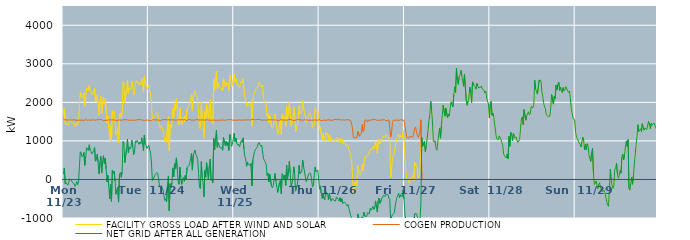
| Category | FACILITY GROSS LOAD AFTER WIND AND SOLAR | COGEN PRODUCTION | NET GRID AFTER ALL GENERATION |
|---|---|---|---|
|  Mon  11/23 | 1685 | 1545 | 140 |
|  Mon  11/23 | 1850 | 1551 | 299 |
|  Mon  11/23 | 1439 | 1550 | -111 |
|  Mon  11/23 | 1461 | 1546 | -85 |
|  Mon  11/23 | 1432 | 1540 | -108 |
|  Mon  11/23 | 1397 | 1543 | -146 |
|  Mon  11/23 | 1468 | 1544 | -76 |
|  Mon  11/23 | 1556 | 1539 | 17 |
|  Mon  11/23 | 1551 | 1543 | 8 |
|  Mon  11/23 | 1516 | 1541 | -25 |
|  Mon  11/23 | 1463 | 1539 | -76 |
|  Mon  11/23 | 1457 | 1539 | -82 |
|  Mon  11/23 | 1445 | 1555 | -110 |
|  Mon  11/23 | 1373 | 1554 | -181 |
|  Mon  11/23 | 1398 | 1533 | -135 |
|  Mon  11/23 | 1483 | 1537 | -54 |
|  Mon  11/23 | 1400 | 1538 | -138 |
|  Mon  11/23 | 1481 | 1542 | -61 |
|  Mon  11/23 | 1896 | 1538 | 358 |
|  Mon  11/23 | 2267 | 1547 | 720 |
|  Mon  11/23 | 2223 | 1538 | 685 |
|  Mon  11/23 | 2127 | 1544 | 583 |
|  Mon  11/23 | 2154 | 1538 | 616 |
|  Mon  11/23 | 2249 | 1549 | 700 |
|  Mon  11/23 | 1902 | 1537 | 365 |
|  Mon  11/23 | 2119 | 1541 | 578 |
|  Mon  11/23 | 2381 | 1557 | 824 |
|  Mon  11/23 | 2376 | 1528 | 848 |
|  Mon  11/23 | 2300 | 1548 | 752 |
|  Mon  11/23 | 2446 | 1547 | 899 |
|  Mon  11/23 | 2305 | 1546 | 759 |
|  Mon  11/23 | 2257 | 1533 | 724 |
|  Mon  11/23 | 2202 | 1540 | 662 |
|  Mon  11/23 | 2196 | 1552 | 644 |
|  Mon  11/23 | 2293 | 1542 | 751 |
|  Mon  11/23 | 2361 | 1534 | 827 |
|  Mon  11/23 | 2014 | 1540 | 474 |
|  Mon  11/23 | 2079 | 1546 | 533 |
|  Mon  11/23 | 2195 | 1536 | 659 |
|  Mon  11/23 | 1981 | 1546 | 435 |
|  Mon  11/23 | 1675 | 1529 | 146 |
|  Mon  11/23 | 1996 | 1555 | 441 |
|  Mon  11/23 | 2155 | 1553 | 602 |
|  Mon  11/23 | 1715 | 1549 | 166 |
|  Mon  11/23 | 1988 | 1543 | 445 |
|  Mon  11/23 | 2144 | 1528 | 616 |
|  Mon  11/23 | 1953 | 1537 | 416 |
|  Mon  11/23 | 2079 | 1534 | 545 |
|  Mon  11/23 | 1812 | 1539 | 273 |
|  Mon  11/23 | 1471 | 1535 | -64 |
|  Mon  11/23 | 1641 | 1533 | 108 |
|  Mon  11/23 | 1363 | 1547 | -184 |
|  Mon  11/23 | 1031 | 1539 | -508 |
|  Mon  11/23 | 1411 | 1544 | -133 |
|  Mon  11/23 | 973 | 1542 | -569 |
|  Mon  11/23 | 1785 | 1543 | 242 |
|  Mon  11/23 | 1711 | 1550 | 161 |
|  Mon  11/23 | 1764 | 1547 | 217 |
|  Mon  11/23 | 1497 | 1535 | -38 |
|  Mon  11/23 | 1149 | 1531 | -382 |
|  Mon  11/23 | 1178 | 1536 | -358 |
|  Mon  11/23 | 1331 | 1533 | -202 |
|  Mon  11/23 | 958 | 1546 | -588 |
|  Mon  11/23 | 1672 | 1544 | 128 |
|  Mon  11/23 | 1723 | 1544 | 179 |
|  Mon  11/23 | 1591 | 1534 | 57 |
|  Mon  11/23 | 1741 | 1542 | 199 |
|  Mon  11/23 | 2535 | 1548 | 987 |
|  Mon  11/23 | 2485 | 1544 | 941 |
|  Mon  11/23 | 1985 | 1550 | 435 |
|  Mon  11/23 | 1994 | 1544 | 450 |
|  Mon  11/23 | 2357 | 1550 | 807 |
|  Mon  11/23 | 2582 | 1538 | 1044 |
|  Mon  11/23 | 2235 | 1538 | 697 |
|  Mon  11/23 | 2374 | 1536 | 838 |
|  Mon  11/23 | 2335 | 1538 | 797 |
|  Mon  11/23 | 2388 | 1548 | 840 |
|  Mon  11/23 | 2552 | 1537 | 1015 |
|  Mon  11/23 | 2377 | 1539 | 838 |
|  Mon  11/23 | 2187 | 1539 | 648 |
|  Mon  11/23 | 2280 | 1531 | 749 |
|  Mon  11/23 | 2538 | 1535 | 1003 |
|  Mon  11/23 | 2505 | 1542 | 963 |
|  Mon  11/23 | 2565 | 1548 | 1017 |
|  Mon  11/23 | 2577 | 1540 | 1037 |
|  Mon  11/23 | 2467 | 1556 | 911 |
|  Mon  11/23 | 2517 | 1543 | 974 |
|  Mon  11/23 | 2463 | 1545 | 918 |
|  Mon  11/23 | 2627 | 1545 | 1082 |
|  Mon  11/23 | 2457 | 1540 | 917 |
|  Mon  11/23 | 2281 | 1540 | 741 |
|  Mon  11/23 | 2686 | 1532 | 1154 |
|  Mon  11/23 | 2463 | 1542 | 921 |
|  Mon  11/23 | 2429 | 1539 | 890 |
|  Mon  11/23 | 2339 | 1534 | 805 |
|  Mon  11/23 | 2363 | 1541 | 822 |
|  Tue  11/24 | 2447 | 1558 | 889 |
|  Tue  11/24 | 2291 | 1522 | 769 |
|  Tue  11/24 | 2225 | 1543 | 682 |
|  Tue  11/24 | 1953 | 1528 | 425 |
|  Tue  11/24 | 1520 | 1548 | -28 |
|  Tue  11/24 | 1565 | 1556 | 9 |
|  Tue  11/24 | 1610 | 1547 | 63 |
|  Tue  11/24 | 1665 | 1543 | 122 |
|  Tue  11/24 | 1704 | 1552 | 152 |
|  Tue  11/24 | 1730 | 1549 | 181 |
|  Tue  11/24 | 1699 | 1544 | 155 |
|  Tue  11/24 | 1555 | 1539 | 16 |
|  Tue  11/24 | 1364 | 1537 | -173 |
|  Tue  11/24 | 1320 | 1527 | -207 |
|  Tue  11/24 | 1393 | 1551 | -158 |
|  Tue  11/24 | 1330 | 1549 | -219 |
|  Tue  11/24 | 1275 | 1552 | -277 |
|  Tue  11/24 | 1131 | 1551 | -420 |
|  Tue  11/24 | 997 | 1542 | -545 |
|  Tue  11/24 | 1055 | 1555 | -500 |
|  Tue  11/24 | 965 | 1544 | -579 |
|  Tue  11/24 | 1393 | 1544 | -151 |
|  Tue  11/24 | 1635 | 1543 | 92 |
|  Tue  11/24 | 735 | 1548 | -813 |
|  Tue  11/24 | 1428 | 1537 | -109 |
|  Tue  11/24 | 1331 | 1546 | -215 |
|  Tue  11/24 | 1451 | 1540 | -89 |
|  Tue  11/24 | 1843 | 1543 | 300 |
|  Tue  11/24 | 1594 | 1528 | 66 |
|  Tue  11/24 | 1953 | 1545 | 408 |
|  Tue  11/24 | 1804 | 1533 | 271 |
|  Tue  11/24 | 2096 | 1536 | 560 |
|  Tue  11/24 | 1820 | 1547 | 273 |
|  Tue  11/24 | 1505 | 1551 | -46 |
|  Tue  11/24 | 1413 | 1538 | -125 |
|  Tue  11/24 | 1862 | 1545 | 317 |
|  Tue  11/24 | 1586 | 1540 | 46 |
|  Tue  11/24 | 1420 | 1547 | -127 |
|  Tue  11/24 | 1551 | 1551 | 0 |
|  Tue  11/24 | 1601 | 1551 | 50 |
|  Tue  11/24 | 1493 | 1540 | -47 |
|  Tue  11/24 | 1655 | 1547 | 108 |
|  Tue  11/24 | 1549 | 1533 | 16 |
|  Tue  11/24 | 1828 | 1524 | 304 |
|  Tue  11/24 | 1833 | 1550 | 283 |
|  Tue  11/24 | 1895 | 1536 | 359 |
|  Tue  11/24 | 1975 | 1555 | 420 |
|  Tue  11/24 | 2075 | 1545 | 530 |
|  Tue  11/24 | 2218 | 1537 | 681 |
|  Tue  11/24 | 1782 | 1539 | 243 |
|  Tue  11/24 | 2174 | 1543 | 631 |
|  Tue  11/24 | 2158 | 1536 | 622 |
|  Tue  11/24 | 2301 | 1539 | 762 |
|  Tue  11/24 | 2190 | 1538 | 652 |
|  Tue  11/24 | 2155 | 1558 | 597 |
|  Tue  11/24 | 2057 | 1546 | 511 |
|  Tue  11/24 | 1699 | 1543 | 156 |
|  Tue  11/24 | 1331 | 1537 | -206 |
|  Tue  11/24 | 1305 | 1541 | -236 |
|  Tue  11/24 | 2008 | 1544 | 464 |
|  Tue  11/24 | 1602 | 1547 | 55 |
|  Tue  11/24 | 1468 | 1544 | -76 |
|  Tue  11/24 | 1087 | 1539 | -452 |
|  Tue  11/24 | 1770 | 1538 | 232 |
|  Tue  11/24 | 1600 | 1541 | 59 |
|  Tue  11/24 | 1971 | 1537 | 434 |
|  Tue  11/24 | 1761 | 1549 | 212 |
|  Tue  11/24 | 1538 | 1548 | -10 |
|  Tue  11/24 | 1879 | 1537 | 342 |
|  Tue  11/24 | 2079 | 1550 | 529 |
|  Tue  11/24 | 1513 | 1536 | -23 |
|  Tue  11/24 | 1550 | 1539 | 11 |
|  Tue  11/24 | 1448 | 1540 | -92 |
|  Tue  11/24 | 2610 | 1547 | 1063 |
|  Tue  11/24 | 2302 | 1538 | 764 |
|  Tue  11/24 | 2599 | 1536 | 1063 |
|  Tue  11/24 | 2810 | 1534 | 1276 |
|  Tue  11/24 | 2360 | 1527 | 833 |
|  Tue  11/24 | 2494 | 1539 | 955 |
|  Tue  11/24 | 2421 | 1530 | 891 |
|  Tue  11/24 | 2362 | 1539 | 823 |
|  Tue  11/24 | 2337 | 1537 | 800 |
|  Tue  11/24 | 2362 | 1540 | 822 |
|  Tue  11/24 | 2299 | 1542 | 757 |
|  Tue  11/24 | 2629 | 1542 | 1087 |
|  Tue  11/24 | 2517 | 1551 | 966 |
|  Tue  11/24 | 2407 | 1533 | 874 |
|  Tue  11/24 | 2522 | 1526 | 996 |
|  Tue  11/24 | 2436 | 1551 | 885 |
|  Tue  11/24 | 2498 | 1538 | 960 |
|  Tue  11/24 | 2300 | 1547 | 753 |
|  Tue  11/24 | 2707 | 1541 | 1166 |
|  Tue  11/24 | 2633 | 1556 | 1077 |
|  Tue  11/24 | 2400 | 1541 | 859 |
|  Tue  11/24 | 2448 | 1539 | 909 |
|  Tue  11/24 | 2454 | 1559 | 895 |
|  Wed  11/25 | 2738 | 1539 | 1199 |
|  Wed  11/25 | 2532 | 1550 | 982 |
|  Wed  11/25 | 2613 | 1538 | 1075 |
|  Wed  11/25 | 2474 | 1534 | 940 |
|  Wed  11/25 | 2429 | 1539 | 890 |
|  Wed  11/25 | 2460 | 1544 | 916 |
|  Wed  11/25 | 2393 | 1545 | 848 |
|  Wed  11/25 | 2387 | 1528 | 859 |
|  Wed  11/25 | 2552 | 1540 | 1012 |
|  Wed  11/25 | 2500 | 1541 | 959 |
|  Wed  11/25 | 2619 | 1541 | 1078 |
|  Wed  11/25 | 2339 | 1556 | 783 |
|  Wed  11/25 | 2136 | 1541 | 595 |
|  Wed  11/25 | 2068 | 1535 | 533 |
|  Wed  11/25 | 1887 | 1544 | 343 |
|  Wed  11/25 | 1989 | 1543 | 446 |
|  Wed  11/25 | 1941 | 1549 | 392 |
|  Wed  11/25 | 1908 | 1533 | 375 |
|  Wed  11/25 | 1899 | 1536 | 363 |
|  Wed  11/25 | 1967 | 1546 | 421 |
|  Wed  11/25 | 1392 | 1560 | -168 |
|  Wed  11/25 | 2054 | 1535 | 519 |
|  Wed  11/25 | 2183 | 1553 | 630 |
|  Wed  11/25 | 2269 | 1539 | 730 |
|  Wed  11/25 | 2329 | 1548 | 781 |
|  Wed  11/25 | 2359 | 1552 | 807 |
|  Wed  11/25 | 2405 | 1555 | 850 |
|  Wed  11/25 | 2469 | 1549 | 920 |
|  Wed  11/25 | 2519 | 1560 | 959 |
|  Wed  11/25 | 2456 | 1557 | 899 |
|  Wed  11/25 | 2402 | 1544 | 858 |
|  Wed  11/25 | 2420 | 1534 | 886 |
|  Wed  11/25 | 2443 | 1537 | 906 |
|  Wed  11/25 | 2077 | 1542 | 535 |
|  Wed  11/25 | 2045 | 1547 | 498 |
|  Wed  11/25 | 2055 | 1546 | 509 |
|  Wed  11/25 | 1925 | 1532 | 393 |
|  Wed  11/25 | 1651 | 1546 | 105 |
|  Wed  11/25 | 1712 | 1551 | 161 |
|  Wed  11/25 | 1481 | 1546 | -65 |
|  Wed  11/25 | 1676 | 1544 | 132 |
|  Wed  11/25 | 1677 | 1537 | 140 |
|  Wed  11/25 | 1371 | 1549 | -178 |
|  Wed  11/25 | 1333 | 1551 | -218 |
|  Wed  11/25 | 1391 | 1543 | -152 |
|  Wed  11/25 | 1397 | 1542 | -145 |
|  Wed  11/25 | 1699 | 1544 | 155 |
|  Wed  11/25 | 1487 | 1542 | -55 |
|  Wed  11/25 | 1483 | 1539 | -56 |
|  Wed  11/25 | 1214 | 1551 | -337 |
|  Wed  11/25 | 1177 | 1521 | -344 |
|  Wed  11/25 | 1454 | 1536 | -82 |
|  Wed  11/25 | 1536 | 1551 | -15 |
|  Wed  11/25 | 1173 | 1545 | -372 |
|  Wed  11/25 | 1691 | 1542 | 149 |
|  Wed  11/25 | 1661 | 1546 | 115 |
|  Wed  11/25 | 1560 | 1544 | 16 |
|  Wed  11/25 | 1650 | 1537 | 113 |
|  Wed  11/25 | 1383 | 1537 | -154 |
|  Wed  11/25 | 1906 | 1537 | 369 |
|  Wed  11/25 | 1563 | 1545 | 18 |
|  Wed  11/25 | 1740 | 1547 | 193 |
|  Wed  11/25 | 2031 | 1559 | 472 |
|  Wed  11/25 | 1710 | 1537 | 173 |
|  Wed  11/25 | 1381 | 1553 | -172 |
|  Wed  11/25 | 1447 | 1548 | -101 |
|  Wed  11/25 | 1541 | 1533 | 8 |
|  Wed  11/25 | 1884 | 1556 | 328 |
|  Wed  11/25 | 1705 | 1530 | 175 |
|  Wed  11/25 | 1236 | 1539 | -303 |
|  Wed  11/25 | 1251 | 1544 | -293 |
|  Wed  11/25 | 1408 | 1546 | -138 |
|  Wed  11/25 | 1582 | 1555 | 27 |
|  Wed  11/25 | 1910 | 1544 | 366 |
|  Wed  11/25 | 1693 | 1546 | 147 |
|  Wed  11/25 | 1669 | 1535 | 134 |
|  Wed  11/25 | 1748 | 1540 | 208 |
|  Wed  11/25 | 2049 | 1545 | 504 |
|  Wed  11/25 | 1882 | 1534 | 348 |
|  Wed  11/25 | 1887 | 1564 | 323 |
|  Wed  11/25 | 1614 | 1537 | 77 |
|  Wed  11/25 | 1479 | 1536 | -57 |
|  Wed  11/25 | 1551 | 1547 | 4 |
|  Wed  11/25 | 1548 | 1549 | -1 |
|  Wed  11/25 | 1679 | 1532 | 147 |
|  Wed  11/25 | 1717 | 1539 | 178 |
|  Wed  11/25 | 1690 | 1539 | 151 |
|  Wed  11/25 | 1561 | 1539 | 22 |
|  Wed  11/25 | 1343 | 1535 | -192 |
|  Wed  11/25 | 1375 | 1540 | -165 |
|  Wed  11/25 | 1405 | 1547 | -142 |
|  Wed  11/25 | 1863 | 1540 | 323 |
|  Wed  11/25 | 1742 | 1538 | 204 |
|  Wed  11/25 | 1763 | 1549 | 214 |
|  Wed  11/25 | 1779 | 1537 | 242 |
|  Wed  11/25 | 1558 | 1541 | 17 |
|  Thu  11/26 | 1305 | 1557 | -252 |
|  Thu  11/26 | 1363 | 1530 | -167 |
|  Thu  11/26 | 1175 | 1540 | -365 |
|  Thu  11/26 | 1035 | 1526 | -491 |
|  Thu  11/26 | 1185 | 1542 | -357 |
|  Thu  11/26 | 1059 | 1544 | -485 |
|  Thu  11/26 | 1001 | 1533 | -532 |
|  Thu  11/26 | 1218 | 1530 | -312 |
|  Thu  11/26 | 1150 | 1536 | -386 |
|  Thu  11/26 | 1189 | 1544 | -355 |
|  Thu  11/26 | 1014 | 1538 | -524 |
|  Thu  11/26 | 1178 | 1543 | -365 |
|  Thu  11/26 | 1054 | 1550 | -496 |
|  Thu  11/26 | 972 | 1538 | -566 |
|  Thu  11/26 | 1063 | 1557 | -494 |
|  Thu  11/26 | 1036 | 1534 | -498 |
|  Thu  11/26 | 1014 | 1549 | -535 |
|  Thu  11/26 | 1000 | 1560 | -560 |
|  Thu  11/26 | 974 | 1537 | -563 |
|  Thu  11/26 | 1098 | 1550 | -452 |
|  Thu  11/26 | 1105 | 1553 | -448 |
|  Thu  11/26 | 1046 | 1563 | -517 |
|  Thu  11/26 | 983 | 1545 | -562 |
|  Thu  11/26 | 1072 | 1543 | -471 |
|  Thu  11/26 | 961 | 1546 | -585 |
|  Thu  11/26 | 1046 | 1545 | -499 |
|  Thu  11/26 | 932 | 1554 | -622 |
|  Thu  11/26 | 941 | 1545 | -604 |
|  Thu  11/26 | 940 | 1526 | -586 |
|  Thu  11/26 | 926 | 1541 | -615 |
|  Thu  11/26 | 884 | 1533 | -649 |
|  Thu  11/26 | 859 | 1549 | -690 |
|  Thu  11/26 | 890 | 1538 | -648 |
|  Thu  11/26 | 793 | 1547 | -754 |
|  Thu  11/26 | 707 | 1553 | -846 |
|  Thu  11/26 | 588 | 1532 | -944 |
|  Thu  11/26 | 520 | 1511 | -991 |
|  Thu  11/26 | 155 | 1346 | -1191 |
|  Thu  11/26 | -374 | 1091 | -1465 |
|  Thu  11/26 | -203 | 1076 | -1279 |
|  Thu  11/26 | -70 | 1081 | -1151 |
|  Thu  11/26 | -59 | 1091 | -1150 |
|  Thu  11/26 | -159 | 1085 | -1244 |
|  Thu  11/26 | 355 | 1248 | -893 |
|  Thu  11/26 | 266 | 1249 | -983 |
|  Thu  11/26 | 112 | 1120 | -1008 |
|  Thu  11/26 | 145 | 1164 | -1019 |
|  Thu  11/26 | 212 | 1197 | -985 |
|  Thu  11/26 | 395 | 1424 | -1029 |
|  Thu  11/26 | 233 | 1244 | -1011 |
|  Thu  11/26 | 441 | 1288 | -847 |
|  Thu  11/26 | 588 | 1543 | -955 |
|  Thu  11/26 | 569 | 1519 | -950 |
|  Thu  11/26 | 579 | 1538 | -959 |
|  Thu  11/26 | 625 | 1489 | -864 |
|  Thu  11/26 | 659 | 1541 | -882 |
|  Thu  11/26 | 642 | 1533 | -891 |
|  Thu  11/26 | 789 | 1535 | -746 |
|  Thu  11/26 | 758 | 1559 | -801 |
|  Thu  11/26 | 786 | 1547 | -761 |
|  Thu  11/26 | 857 | 1553 | -696 |
|  Thu  11/26 | 782 | 1562 | -780 |
|  Thu  11/26 | 814 | 1555 | -741 |
|  Thu  11/26 | 994 | 1550 | -556 |
|  Thu  11/26 | 807 | 1539 | -732 |
|  Thu  11/26 | 687 | 1534 | -847 |
|  Thu  11/26 | 983 | 1537 | -554 |
|  Thu  11/26 | 1053 | 1534 | -481 |
|  Thu  11/26 | 929 | 1549 | -620 |
|  Thu  11/26 | 949 | 1545 | -596 |
|  Thu  11/26 | 1043 | 1538 | -495 |
|  Thu  11/26 | 1027 | 1542 | -515 |
|  Thu  11/26 | 1135 | 1548 | -413 |
|  Thu  11/26 | 1124 | 1555 | -431 |
|  Thu  11/26 | 1089 | 1529 | -440 |
|  Thu  11/26 | 1166 | 1545 | -379 |
|  Thu  11/26 | 1137 | 1529 | -392 |
|  Thu  11/26 | 1147 | 1544 | -397 |
|  Thu  11/26 | 1059 | 1543 | -484 |
|  Thu  11/26 | 1013 | 1538 | -525 |
|  Thu  11/26 | 39 | 1103 | -1064 |
|  Thu  11/26 | 243 | 1215 | -972 |
|  Thu  11/26 | 567 | 1481 | -914 |
|  Thu  11/26 | 616 | 1536 | -920 |
|  Thu  11/26 | 665 | 1541 | -876 |
|  Thu  11/26 | 825 | 1537 | -712 |
|  Thu  11/26 | 977 | 1548 | -571 |
|  Thu  11/26 | 1071 | 1542 | -471 |
|  Thu  11/26 | 1048 | 1540 | -492 |
|  Thu  11/26 | 1173 | 1530 | -357 |
|  Thu  11/26 | 1062 | 1534 | -472 |
|  Thu  11/26 | 1155 | 1550 | -395 |
|  Thu  11/26 | 1152 | 1547 | -395 |
|  Thu  11/26 | 1087 | 1538 | -451 |
|  Thu  11/26 | 1273 | 1539 | -266 |
|  Thu  11/26 | 1021 | 1540 | -519 |
|  Fri  11/27 | 622 | 1540 | -918 |
|  Fri  11/27 | 211 | 1246 | -1035 |
|  Fri  11/27 | 49 | 1097 | -1048 |
|  Fri  11/27 | 59 | 1079 | -1020 |
|  Fri  11/27 | 1 | 1065 | -1064 |
|  Fri  11/27 | -101 | 1108 | -1209 |
|  Fri  11/27 | 33 | 1089 | -1056 |
|  Fri  11/27 | 20 | 1110 | -1090 |
|  Fri  11/27 | 60 | 1092 | -1032 |
|  Fri  11/27 | 96 | 1098 | -1002 |
|  Fri  11/27 | -32 | 1092 | -1124 |
|  Fri  11/27 | 438 | 1326 | -888 |
|  Fri  11/27 | 462 | 1363 | -901 |
|  Fri  11/27 | 346 | 1237 | -891 |
|  Fri  11/27 | 264 | 1146 | -882 |
|  Fri  11/27 | 42 | 1092 | -1050 |
|  Fri  11/27 | 98 | 1162 | -1064 |
|  Fri  11/27 | 196 | 1255 | -1059 |
|  Fri  11/27 | 942 | 1547 | -605 |
|  Fri  11/27 | 1086 | 0 | 1086 |
|  Fri  11/27 | 858 | 0 | 858 |
|  Fri  11/27 | 862 | 0 | 862 |
|  Fri  11/27 | 987 | 0 | 987 |
|  Fri  11/27 | 723 | 0 | 723 |
|  Fri  11/27 | 875 | 0 | 875 |
|  Fri  11/27 | 1064 | 0 | 1064 |
|  Fri  11/27 | 1286 | 0 | 1286 |
|  Fri  11/27 | 1528 | 0 | 1528 |
|  Fri  11/27 | 1667 | 0 | 1667 |
|  Fri  11/27 | 2027 | 0 | 2027 |
|  Fri  11/27 | 1802 | 0 | 1802 |
|  Fri  11/27 | 1496 | 0 | 1496 |
|  Fri  11/27 | 1005 | 0 | 1005 |
|  Fri  11/27 | 969 | 0 | 969 |
|  Fri  11/27 | 1007 | 0 | 1007 |
|  Fri  11/27 | 805 | 0 | 805 |
|  Fri  11/27 | 758 | 0 | 758 |
|  Fri  11/27 | 746 | 0 | 746 |
|  Fri  11/27 | 1165 | 0 | 1165 |
|  Fri  11/27 | 1324 | 0 | 1324 |
|  Fri  11/27 | 1068 | 0 | 1068 |
|  Fri  11/27 | 1382 | 0 | 1382 |
|  Fri  11/27 | 1388 | 0 | 1388 |
|  Fri  11/27 | 1927 | 0 | 1927 |
|  Fri  11/27 | 1918 | 0 | 1918 |
|  Fri  11/27 | 1641 | 0 | 1641 |
|  Fri  11/27 | 1854 | 0 | 1854 |
|  Fri  11/27 | 1866 | 0 | 1866 |
|  Fri  11/27 | 1604 | 0 | 1604 |
|  Fri  11/27 | 1695 | 0 | 1695 |
|  Fri  11/27 | 1644 | 0 | 1644 |
|  Fri  11/27 | 1860 | 0 | 1860 |
|  Fri  11/27 | 2013 | 0 | 2013 |
|  Fri  11/27 | 2020 | 0 | 2020 |
|  Fri  11/27 | 1885 | 0 | 1885 |
|  Fri  11/27 | 2210 | 0 | 2210 |
|  Fri  11/27 | 2404 | 0 | 2404 |
|  Fri  11/27 | 2256 | 0 | 2256 |
|  Fri  11/27 | 2883 | 0 | 2883 |
|  Fri  11/27 | 2572 | 0 | 2572 |
|  Fri  11/27 | 2465 | 0 | 2465 |
|  Fri  11/27 | 2661 | 0 | 2661 |
|  Fri  11/27 | 2710 | 0 | 2710 |
|  Fri  11/27 | 2831 | 0 | 2831 |
|  Fri  11/27 | 2685 | 0 | 2685 |
|  Fri  11/27 | 2556 | 0 | 2556 |
|  Fri  11/27 | 2416 | 0 | 2416 |
|  Fri  11/27 | 2725 | 0 | 2725 |
|  Fri  11/27 | 2708 | 0 | 2708 |
|  Fri  11/27 | 2048 | 0 | 2048 |
|  Fri  11/27 | 1922 | 0 | 1922 |
|  Fri  11/27 | 2031 | 0 | 2031 |
|  Fri  11/27 | 2138 | 0 | 2138 |
|  Fri  11/27 | 2398 | 0 | 2398 |
|  Fri  11/27 | 2258 | 0 | 2258 |
|  Fri  11/27 | 1994 | 0 | 1994 |
|  Fri  11/27 | 2532 | 0 | 2532 |
|  Fri  11/27 | 2515 | 0 | 2515 |
|  Fri  11/27 | 2433 | 0 | 2433 |
|  Fri  11/27 | 2405 | 0 | 2405 |
|  Fri  11/27 | 2342 | 0 | 2342 |
|  Fri  11/27 | 2488 | 0 | 2488 |
|  Fri  11/27 | 2422 | 0 | 2422 |
|  Fri  11/27 | 2373 | 0 | 2373 |
|  Fri  11/27 | 2360 | 0 | 2360 |
|  Fri  11/27 | 2391 | 0 | 2391 |
|  Fri  11/27 | 2425 | 0 | 2425 |
|  Fri  11/27 | 2348 | 0 | 2348 |
|  Fri  11/27 | 2371 | 0 | 2371 |
|  Fri  11/27 | 2312 | 0 | 2312 |
|  Fri  11/27 | 2242 | 0 | 2242 |
|  Fri  11/27 | 2289 | 0 | 2289 |
|  Fri  11/27 | 2108 | 0 | 2108 |
|  Fri  11/27 | 2021 | 0 | 2021 |
|  Fri  11/27 | 1957 | 0 | 1957 |
|  Fri  11/27 | 1595 | 0 | 1595 |
|  Sat  11/28 | 1960 | 0 | 1960 |
|  Sat  11/28 | 2022 | 0 | 2022 |
|  Sat  11/28 | 1661 | 0 | 1661 |
|  Sat  11/28 | 1724 | 0 | 1724 |
|  Sat  11/28 | 1614 | 0 | 1614 |
|  Sat  11/28 | 1421 | 0 | 1421 |
|  Sat  11/28 | 1437 | 0 | 1437 |
|  Sat  11/28 | 1064 | 0 | 1064 |
|  Sat  11/28 | 1049 | 0 | 1049 |
|  Sat  11/28 | 1029 | 0 | 1029 |
|  Sat  11/28 | 1132 | 0 | 1132 |
|  Sat  11/28 | 1149 | 0 | 1149 |
|  Sat  11/28 | 1045 | 0 | 1045 |
|  Sat  11/28 | 959 | 0 | 959 |
|  Sat  11/28 | 890 | 0 | 890 |
|  Sat  11/28 | 662 | 0 | 662 |
|  Sat  11/28 | 616 | 0 | 616 |
|  Sat  11/28 | 637 | 0 | 637 |
|  Sat  11/28 | 559 | 0 | 559 |
|  Sat  11/28 | 660 | 0 | 660 |
|  Sat  11/28 | 541 | 0 | 541 |
|  Sat  11/28 | 1116 | 0 | 1116 |
|  Sat  11/28 | 857 | 0 | 857 |
|  Sat  11/28 | 1225 | 0 | 1225 |
|  Sat  11/28 | 1163 | 0 | 1163 |
|  Sat  11/28 | 1007 | 0 | 1007 |
|  Sat  11/28 | 1193 | 0 | 1193 |
|  Sat  11/28 | 1125 | 0 | 1125 |
|  Sat  11/28 | 1072 | 0 | 1072 |
|  Sat  11/28 | 1104 | 0 | 1104 |
|  Sat  11/28 | 1021 | 0 | 1021 |
|  Sat  11/28 | 963 | 0 | 963 |
|  Sat  11/28 | 978 | 0 | 978 |
|  Sat  11/28 | 1032 | 0 | 1032 |
|  Sat  11/28 | 1316 | 0 | 1316 |
|  Sat  11/28 | 1574 | 0 | 1574 |
|  Sat  11/28 | 1626 | 0 | 1626 |
|  Sat  11/28 | 1416 | 0 | 1416 |
|  Sat  11/28 | 1813 | 0 | 1813 |
|  Sat  11/28 | 1800 | 0 | 1800 |
|  Sat  11/28 | 1537 | 0 | 1537 |
|  Sat  11/28 | 1656 | 0 | 1656 |
|  Sat  11/28 | 1641 | 0 | 1641 |
|  Sat  11/28 | 1757 | 0 | 1757 |
|  Sat  11/28 | 1675 | 0 | 1675 |
|  Sat  11/28 | 1707 | 0 | 1707 |
|  Sat  11/28 | 1893 | 0 | 1893 |
|  Sat  11/28 | 1908 | 0 | 1908 |
|  Sat  11/28 | 1859 | 0 | 1859 |
|  Sat  11/28 | 1949 | 0 | 1949 |
|  Sat  11/28 | 2574 | 0 | 2574 |
|  Sat  11/28 | 2348 | 0 | 2348 |
|  Sat  11/28 | 2339 | 0 | 2339 |
|  Sat  11/28 | 2213 | 0 | 2213 |
|  Sat  11/28 | 2211 | 0 | 2211 |
|  Sat  11/28 | 2580 | 0 | 2580 |
|  Sat  11/28 | 2604 | 0 | 2604 |
|  Sat  11/28 | 2567 | 0 | 2567 |
|  Sat  11/28 | 2275 | 0 | 2275 |
|  Sat  11/28 | 2161 | 0 | 2161 |
|  Sat  11/28 | 1988 | 0 | 1988 |
|  Sat  11/28 | 1880 | 0 | 1880 |
|  Sat  11/28 | 1846 | 0 | 1846 |
|  Sat  11/28 | 1675 | 0 | 1675 |
|  Sat  11/28 | 1699 | 0 | 1699 |
|  Sat  11/28 | 1636 | 0 | 1636 |
|  Sat  11/28 | 1630 | 0 | 1630 |
|  Sat  11/28 | 1640 | 0 | 1640 |
|  Sat  11/28 | 1855 | 0 | 1855 |
|  Sat  11/28 | 2204 | 0 | 2204 |
|  Sat  11/28 | 2216 | 0 | 2216 |
|  Sat  11/28 | 1955 | 0 | 1955 |
|  Sat  11/28 | 2155 | 0 | 2155 |
|  Sat  11/28 | 2097 | 0 | 2097 |
|  Sat  11/28 | 2443 | 0 | 2443 |
|  Sat  11/28 | 2320 | 0 | 2320 |
|  Sat  11/28 | 2468 | 0 | 2468 |
|  Sat  11/28 | 2526 | 0 | 2526 |
|  Sat  11/28 | 2308 | 0 | 2308 |
|  Sat  11/28 | 2394 | 0 | 2394 |
|  Sat  11/28 | 2320 | 0 | 2320 |
|  Sat  11/28 | 2253 | 0 | 2253 |
|  Sat  11/28 | 2385 | 0 | 2385 |
|  Sat  11/28 | 2300 | 0 | 2300 |
|  Sat  11/28 | 2328 | 0 | 2328 |
|  Sat  11/28 | 2408 | 0 | 2408 |
|  Sat  11/28 | 2424 | 0 | 2424 |
|  Sat  11/28 | 2299 | 0 | 2299 |
|  Sat  11/28 | 2261 | 0 | 2261 |
|  Sat  11/28 | 2294 | 0 | 2294 |
|  Sat  11/28 | 2127 | 0 | 2127 |
|  Sat  11/28 | 1843 | 0 | 1843 |
|  Sat  11/28 | 1729 | 0 | 1729 |
|  Sat  11/28 | 1594 | 0 | 1594 |
|  Sat  11/28 | 1568 | 0 | 1568 |
|  Sat  11/28 | 1518 | 0 | 1518 |
|  Sun  11/29 | 1219 | 0 | 1219 |
|  Sun  11/29 | 1092 | 0 | 1092 |
|  Sun  11/29 | 1065 | 0 | 1065 |
|  Sun  11/29 | 996 | 0 | 996 |
|  Sun  11/29 | 1007 | 0 | 1007 |
|  Sun  11/29 | 910 | 0 | 910 |
|  Sun  11/29 | 844 | 0 | 844 |
|  Sun  11/29 | 968 | 0 | 968 |
|  Sun  11/29 | 1096 | 0 | 1096 |
|  Sun  11/29 | 1031 | 0 | 1031 |
|  Sun  11/29 | 768 | 0 | 768 |
|  Sun  11/29 | 907 | 0 | 907 |
|  Sun  11/29 | 771 | 0 | 771 |
|  Sun  11/29 | 928 | 0 | 928 |
|  Sun  11/29 | 874 | 0 | 874 |
|  Sun  11/29 | 631 | 0 | 631 |
|  Sun  11/29 | 622 | 0 | 622 |
|  Sun  11/29 | 466 | 0 | 466 |
|  Sun  11/29 | 706 | 0 | 706 |
|  Sun  11/29 | 810 | 0 | 810 |
|  Sun  11/29 | 178 | 0 | 178 |
|  Sun  11/29 | -133 | 0 | -133 |
|  Sun  11/29 | -92 | 0 | -92 |
|  Sun  11/29 | -37 | 0 | -37 |
|  Sun  11/29 | -151 | 0 | -151 |
|  Sun  11/29 | -235 | 0 | -235 |
|  Sun  11/29 | -134 | 0 | -134 |
|  Sun  11/29 | -83 | 0 | -83 |
|  Sun  11/29 | -209 | 0 | -209 |
|  Sun  11/29 | -268 | 0 | -268 |
|  Sun  11/29 | -318 | 0 | -318 |
|  Sun  11/29 | -315 | 0 | -315 |
|  Sun  11/29 | -281 | 0 | -281 |
|  Sun  11/29 | -346 | 0 | -346 |
|  Sun  11/29 | -460 | 0 | -460 |
|  Sun  11/29 | -584 | 0 | -584 |
|  Sun  11/29 | -661 | 0 | -661 |
|  Sun  11/29 | -698 | 0 | -698 |
|  Sun  11/29 | -237 | 0 | -237 |
|  Sun  11/29 | 263 | 0 | 263 |
|  Sun  11/29 | -12 | 0 | -12 |
|  Sun  11/29 | -161 | 0 | -161 |
|  Sun  11/29 | -233 | 0 | -233 |
|  Sun  11/29 | -171 | 0 | -171 |
|  Sun  11/29 | 251 | 0 | 251 |
|  Sun  11/29 | 300 | 0 | 300 |
|  Sun  11/29 | 422 | 0 | 422 |
|  Sun  11/29 | 146 | 0 | 146 |
|  Sun  11/29 | 31 | 0 | 31 |
|  Sun  11/29 | 98 | 0 | 98 |
|  Sun  11/29 | 234 | 0 | 234 |
|  Sun  11/29 | 161 | 0 | 161 |
|  Sun  11/29 | 583 | 0 | 583 |
|  Sun  11/29 | 661 | 0 | 661 |
|  Sun  11/29 | 508 | 0 | 508 |
|  Sun  11/29 | 628 | 0 | 628 |
|  Sun  11/29 | 844 | 0 | 844 |
|  Sun  11/29 | 996 | 0 | 996 |
|  Sun  11/29 | 855 | 0 | 855 |
|  Sun  11/29 | 1033 | 0 | 1033 |
|  Sun  11/29 | -232 | 0 | -232 |
|  Sun  11/29 | -277 | 0 | -277 |
|  Sun  11/29 | -272 | 0 | -272 |
|  Sun  11/29 | 58 | 0 | 58 |
|  Sun  11/29 | -125 | 0 | -125 |
|  Sun  11/29 | 90 | 0 | 90 |
|  Sun  11/29 | 387 | 0 | 387 |
|  Sun  11/29 | 643 | 0 | 643 |
|  Sun  11/29 | 909 | 0 | 909 |
|  Sun  11/29 | 1105 | 0 | 1105 |
|  Sun  11/29 | 1420 | 0 | 1420 |
|  Sun  11/29 | 1241 | 0 | 1241 |
|  Sun  11/29 | 1248 | 0 | 1248 |
|  Sun  11/29 | 1315 | 0 | 1315 |
|  Sun  11/29 | 1242 | 0 | 1242 |
|  Sun  11/29 | 1449 | 0 | 1449 |
|  Sun  11/29 | 1341 | 0 | 1341 |
|  Sun  11/29 | 1276 | 0 | 1276 |
|  Sun  11/29 | 1336 | 0 | 1336 |
|  Sun  11/29 | 1356 | 0 | 1356 |
|  Sun  11/29 | 1294 | 0 | 1294 |
|  Sun  11/29 | 1409 | 0 | 1409 |
|  Sun  11/29 | 1506 | 0 | 1506 |
|  Sun  11/29 | 1423 | 0 | 1423 |
|  Sun  11/29 | 1314 | 0 | 1314 |
|  Sun  11/29 | 1457 | 0 | 1457 |
|  Sun  11/29 | 1409 | 0 | 1409 |
|  Sun  11/29 | 1395 | 0 | 1395 |
|  Sun  11/29 | 1463 | 0 | 1463 |
|  Sun  11/29 | 1411 | 0 | 1411 |
|  Sun  11/29 | 1355 | 0 | 1355 |
|  Sun  11/29 | 1303 | 0 | 1303 |